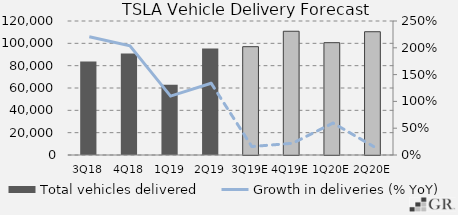
| Category | Total vehicles delivered  |
|---|---|
|  3Q18  | 83775 |
|  4Q18  | 90966 |
|  1Q19  | 63019 |
|  2Q19  | 95356 |
|  3Q19E  | 97000 |
|  4Q19E  | 110809.677 |
|  1Q20E  | 100579.25 |
|  2Q20E  | 110390 |